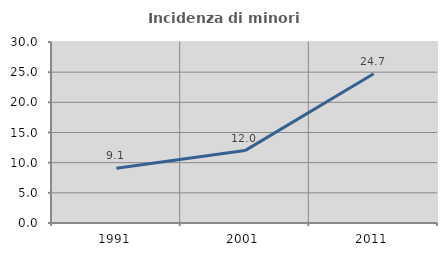
| Category | Incidenza di minori stranieri |
|---|---|
| 1991.0 | 9.091 |
| 2001.0 | 12 |
| 2011.0 | 24.742 |